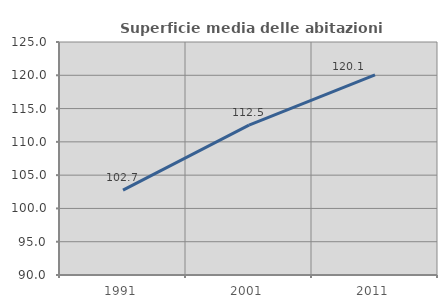
| Category | Superficie media delle abitazioni occupate |
|---|---|
| 1991.0 | 102.746 |
| 2001.0 | 112.507 |
| 2011.0 | 120.058 |